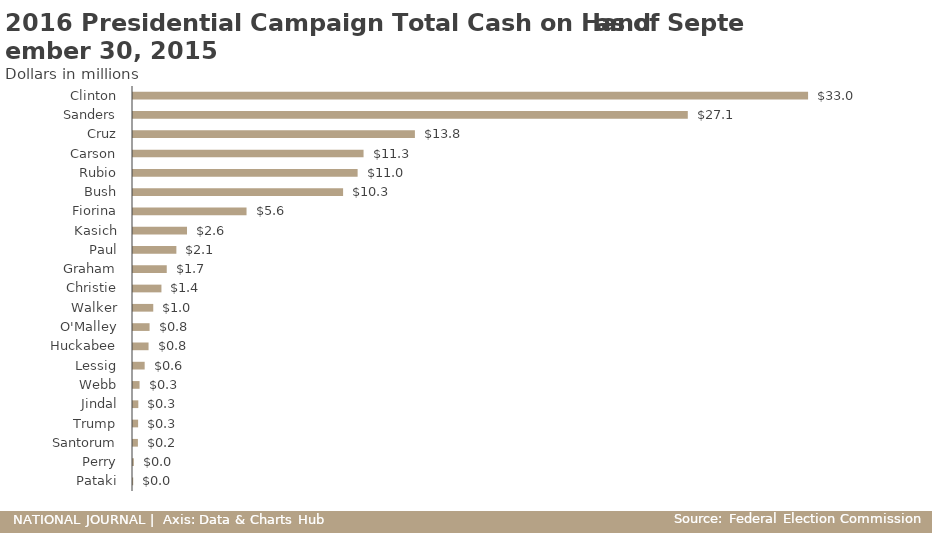
| Category | Cash on Hand (millions) |
|---|---|
| Pataki | 0.01 |
| Perry | 0.04 |
| Santorum | 0.24 |
| Trump | 0.25 |
| Jindal | 0.26 |
| Webb | 0.32 |
| Lessig | 0.57 |
| Huckabee | 0.76 |
| O'Malley | 0.81 |
| Walker | 0.99 |
| Christie | 1.39 |
| Graham | 1.65 |
| Paul | 2.12 |
| Kasich | 2.64 |
| Fiorina | 5.55 |
| Bush | 10.27 |
| Rubio | 10.98 |
| Carson | 11.27 |
| Cruz | 13.78 |
| Sanders | 27.12 |
| Clinton | 33 |